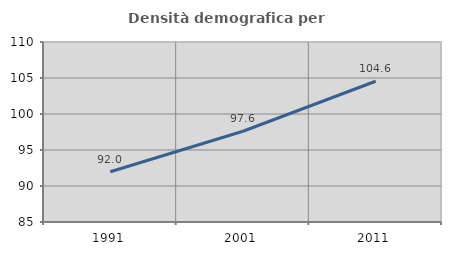
| Category | Densità demografica |
|---|---|
| 1991.0 | 91.987 |
| 2001.0 | 97.607 |
| 2011.0 | 104.551 |